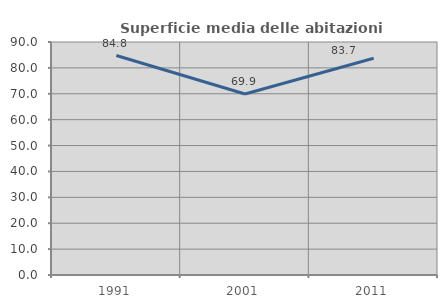
| Category | Superficie media delle abitazioni occupate |
|---|---|
| 1991.0 | 84.771 |
| 2001.0 | 69.906 |
| 2011.0 | 83.714 |